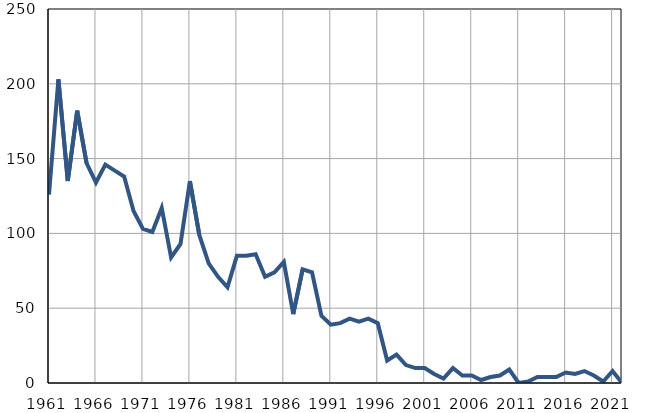
| Category | Умрла 
одојчад |
|---|---|
| 1961.0 | 126 |
| 1962.0 | 203 |
| 1963.0 | 135 |
| 1964.0 | 182 |
| 1965.0 | 147 |
| 1966.0 | 134 |
| 1967.0 | 146 |
| 1968.0 | 142 |
| 1969.0 | 138 |
| 1970.0 | 115 |
| 1971.0 | 103 |
| 1972.0 | 101 |
| 1973.0 | 117 |
| 1974.0 | 84 |
| 1975.0 | 93 |
| 1976.0 | 135 |
| 1977.0 | 99 |
| 1978.0 | 80 |
| 1979.0 | 71 |
| 1980.0 | 64 |
| 1981.0 | 85 |
| 1982.0 | 85 |
| 1983.0 | 86 |
| 1984.0 | 71 |
| 1985.0 | 74 |
| 1986.0 | 81 |
| 1987.0 | 46 |
| 1988.0 | 76 |
| 1989.0 | 74 |
| 1990.0 | 45 |
| 1991.0 | 39 |
| 1992.0 | 40 |
| 1993.0 | 43 |
| 1994.0 | 41 |
| 1995.0 | 43 |
| 1996.0 | 40 |
| 1997.0 | 15 |
| 1998.0 | 19 |
| 1999.0 | 12 |
| 2000.0 | 10 |
| 2001.0 | 10 |
| 2002.0 | 6 |
| 2003.0 | 3 |
| 2004.0 | 10 |
| 2005.0 | 5 |
| 2006.0 | 5 |
| 2007.0 | 2 |
| 2008.0 | 4 |
| 2009.0 | 5 |
| 2010.0 | 9 |
| 2011.0 | 0 |
| 2012.0 | 1 |
| 2013.0 | 4 |
| 2014.0 | 4 |
| 2015.0 | 4 |
| 2016.0 | 7 |
| 2017.0 | 6 |
| 2018.0 | 8 |
| 2019.0 | 5 |
| 2020.0 | 1 |
| 2021.0 | 8 |
| 2022.0 | 0 |